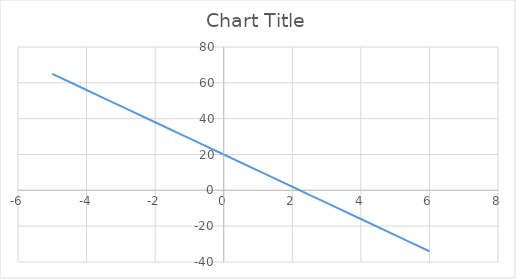
| Category | Series 0 |
|---|---|
| -5.0 | 65 |
| -4.0 | 56 |
| -3.0 | 47 |
| -2.0 | 38 |
| -1.0 | 29 |
| 0.0 | 20 |
| 1.0 | 11 |
| 2.0 | 2 |
| 3.0 | -7 |
| 4.0 | -16 |
| 5.0 | -25 |
| 6.0 | -34 |